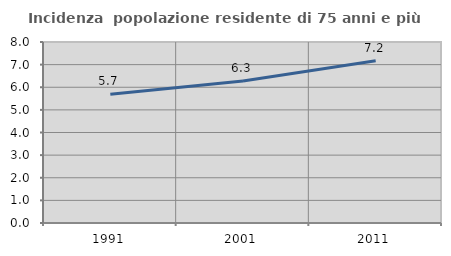
| Category | Incidenza  popolazione residente di 75 anni e più |
|---|---|
| 1991.0 | 5.694 |
| 2001.0 | 6.275 |
| 2011.0 | 7.176 |